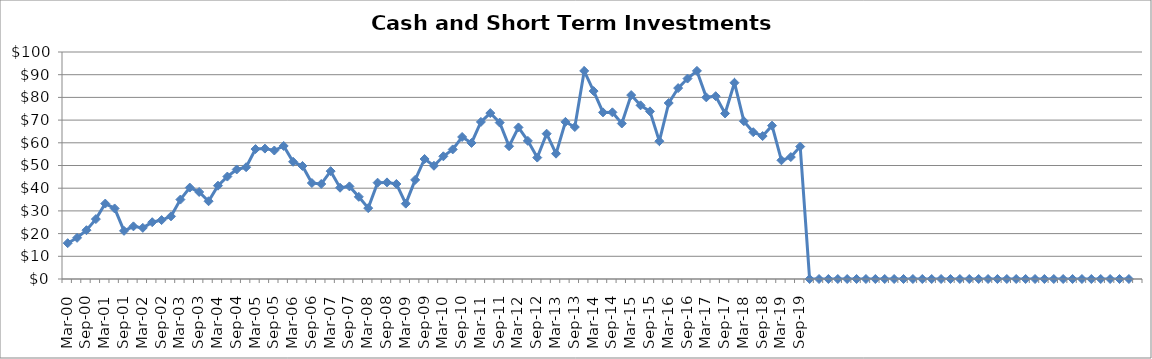
| Category | Cash and Short-Term Investments ($Millions) |
|---|---|
| Mar-00 | 15.778 |
| Jun-00 | 18.133 |
| Sep-00 | 21.5 |
| Dec-00 | 26.388 |
| Mar-01 | 33.226 |
| Jun-01 | 31.077 |
| Sep-01 | 21.214 |
| Dec-01 | 23.191 |
| Mar-02 | 22.527 |
| Jun-02 | 25.018 |
| Sep-02 | 25.956 |
| Dec-02 | 27.609 |
| Mar-03 | 34.994 |
| Jun-03 | 40.276 |
| Sep-03 | 38.334 |
| Dec-03 | 34.256 |
| Mar-04 | 41.099 |
| Jun-04 | 45.12 |
| Sep-04 | 48.252 |
| Dec-04 | 49.248 |
| Mar-05 | 57.239 |
| Jun-05 | 57.447 |
| Sep-05 | 56.608 |
| Dec-05 | 58.604 |
| Mar-06 | 51.644 |
| Jun-06 | 49.8 |
| Sep-06 | 42.28 |
| Dec-06 | 41.854 |
| Mar-07 | 47.512 |
| Jun-07 | 40.204 |
| Sep-07 | 40.791 |
| Dec-07 | 36.197 |
| Mar-08 | 31.216 |
| Jun-08 | 42.434 |
| Sep-08 | 42.56 |
| Dec-08 | 41.862 |
| Mar-09 | 33.194 |
| Jun-09 | 43.655 |
| Sep-09 | 52.866 |
| Dec-09 | 49.877 |
| Mar-10 | 54.048 |
| Jun-10 | 57.086 |
| Sep-10 | 62.562 |
| Dec-10 | 59.93 |
| Mar-11 | 69.198 |
| Jun-11 | 73.1 |
| Sep-11 | 68.9 |
| Dec-11 | 58.493 |
| Mar-12 | 66.768 |
| Jun-12 | 60.847 |
| Sep-12 | 53.484 |
| Dec-12 | 64.009 |
| Mar-13 | 55.21 |
| Jun-13 | 69.23 |
| Sep-13 | 66.952 |
| Dec-13 | 91.666 |
| Mar-14 | 82.79 |
| Jun-14 | 73.399 |
| Sep-14 | 73.419 |
| Dec-14 | 68.51 |
| Mar-15 | 81.021 |
| Jun-15 | 76.506 |
| Sep-15 | 73.848 |
| Dec-15 | 60.706 |
| Mar-16 | 77.533 |
| Jun-16 | 84.094 |
| Sep-16 | 88.304 |
| Dec-16 | 91.68 |
| Mar-17 | 80.022 |
| Jun-17 | 80.536 |
| Sep-17 | 72.924 |
| Dec-17 | 86.458 |
| Mar-18 | 69.526 |
| Jun-18 | 64.674 |
| Sep-18 | 62.965 |
| Dec-18 | 67.562 |
| Mar-19 | 52.288 |
| Jun-19 | 53.714 |
| Sep-19 | 58.342 |